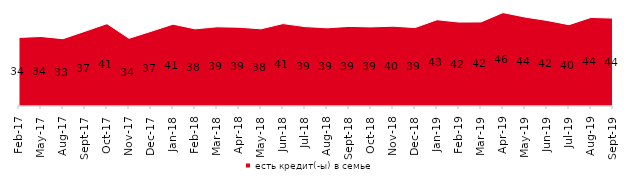
| Category | есть кредит(-ы) в семье |
|---|---|
| 2017-02-01 | 33.95 |
| 2017-05-01 | 34.4 |
| 2017-08-01 | 33.3 |
| 2017-09-01 | 37 |
| 2017-10-01 | 40.75 |
| 2017-11-01 | 33.5 |
| 2017-12-01 | 36.95 |
| 2018-01-01 | 40.5 |
| 2018-02-01 | 38.2 |
| 2018-03-01 | 39.2 |
| 2018-04-01 | 39 |
| 2018-05-01 | 38.2 |
| 2018-06-01 | 40.8 |
| 2018-07-01 | 39.3 |
| 2018-08-01 | 38.7 |
| 2018-09-01 | 39.4 |
| 2018-10-01 | 39.15 |
| 2018-11-01 | 39.521 |
| 2018-12-01 | 38.8 |
| 2019-01-01 | 42.7 |
| 2019-02-01 | 41.55 |
| 2019-03-01 | 41.621 |
| 2019-04-01 | 46.238 |
| 2019-05-01 | 44.032 |
| 2019-06-01 | 42.344 |
| 2019-07-01 | 40.248 |
| 2019-08-01 | 43.856 |
| 2019-09-01 | 43.515 |